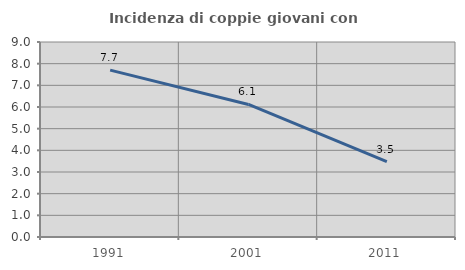
| Category | Incidenza di coppie giovani con figli |
|---|---|
| 1991.0 | 7.703 |
| 2001.0 | 6.117 |
| 2011.0 | 3.482 |